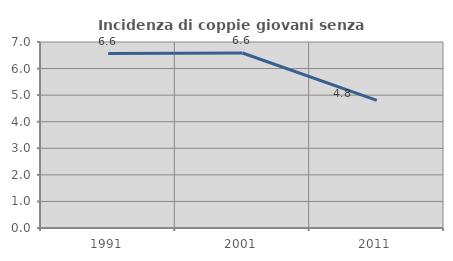
| Category | Incidenza di coppie giovani senza figli |
|---|---|
| 1991.0 | 6.565 |
| 2001.0 | 6.585 |
| 2011.0 | 4.802 |